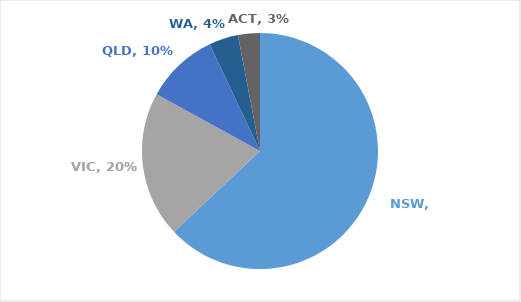
| Category | Series 0 |
|---|---|
| NSW | 0.63 |
| VIC | 0.2 |
| QLD | 0.1 |
| WA | 0.04 |
| ACT | 0.03 |